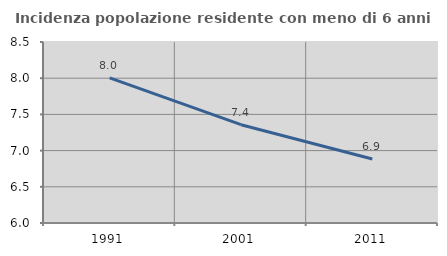
| Category | Incidenza popolazione residente con meno di 6 anni |
|---|---|
| 1991.0 | 8.004 |
| 2001.0 | 7.358 |
| 2011.0 | 6.885 |